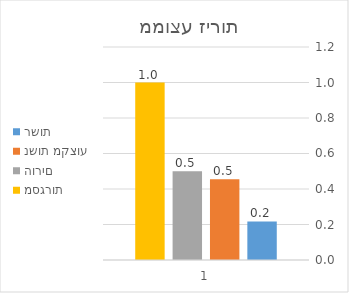
| Category | רשות | נשות מקצוע | הורים | מסגרות |
|---|---|---|---|---|
| 0 | 0.217 | 0.455 | 0.5 | 1 |